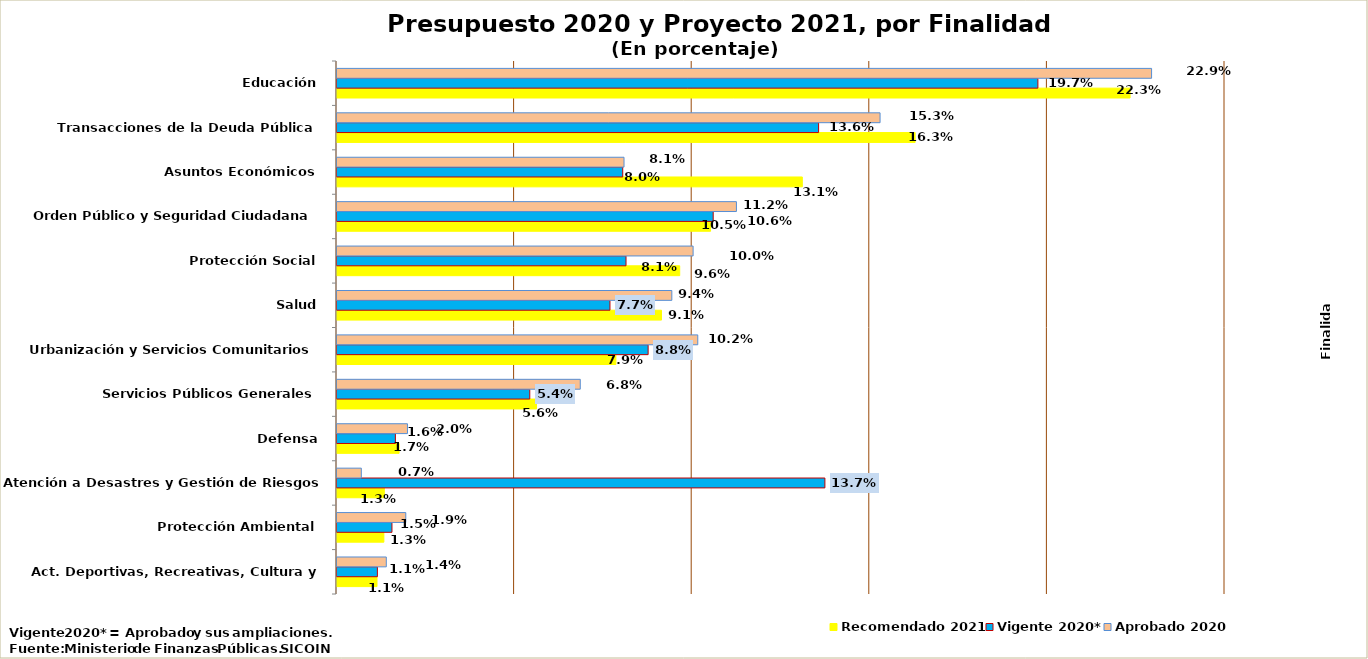
| Category | Recomendado 2021 | Vigente 2020* | Aprobado 2020 |
|---|---|---|---|
| Act. Deportivas, Recreativas, Cultura y Religión | 0.011 | 0.011 | 0.014 |
| Protección Ambiental | 0.013 | 0.015 | 0.019 |
| Atención a Desastres y Gestión de Riesgos | 0.013 | 0.137 | 0.007 |
| Defensa | 0.017 | 0.016 | 0.02 |
| Servicios Públicos Generales | 0.056 | 0.054 | 0.068 |
| Urbanización y Servicios Comunitarios | 0.079 | 0.088 | 0.102 |
| Salud | 0.091 | 0.077 | 0.094 |
| Protección Social | 0.096 | 0.081 | 0.1 |
| Orden Público y Seguridad Ciudadana | 0.105 | 0.106 | 0.112 |
| Asuntos Económicos | 0.131 | 0.08 | 0.081 |
| Transacciones de la Deuda Pública | 0.163 | 0.136 | 0.153 |
| Educación | 0.223 | 0.197 | 0.229 |